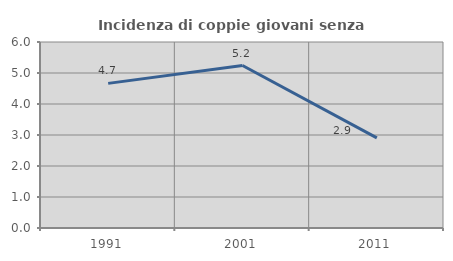
| Category | Incidenza di coppie giovani senza figli |
|---|---|
| 1991.0 | 4.665 |
| 2001.0 | 5.241 |
| 2011.0 | 2.908 |